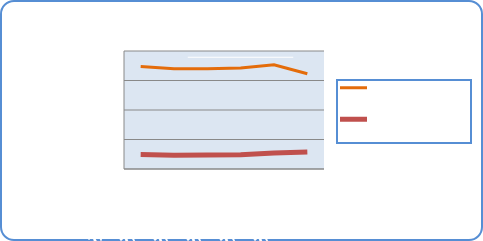
| Category | Motorin Türleri  | Benzin Türleri |
|---|---|---|
| 7/9/18 | 69452959.863 | 9807399.319 |
| 7/10/18 | 67901974.821 | 9397066.015 |
| 7/11/18 | 67959479.78 | 9496909.065 |
| 7/12/18 | 68488692.378 | 9695556.743 |
| 7/13/18 | 70599583.12 | 10798491.256 |
| 7/14/18 | 64573603.642 | 11457395.71 |